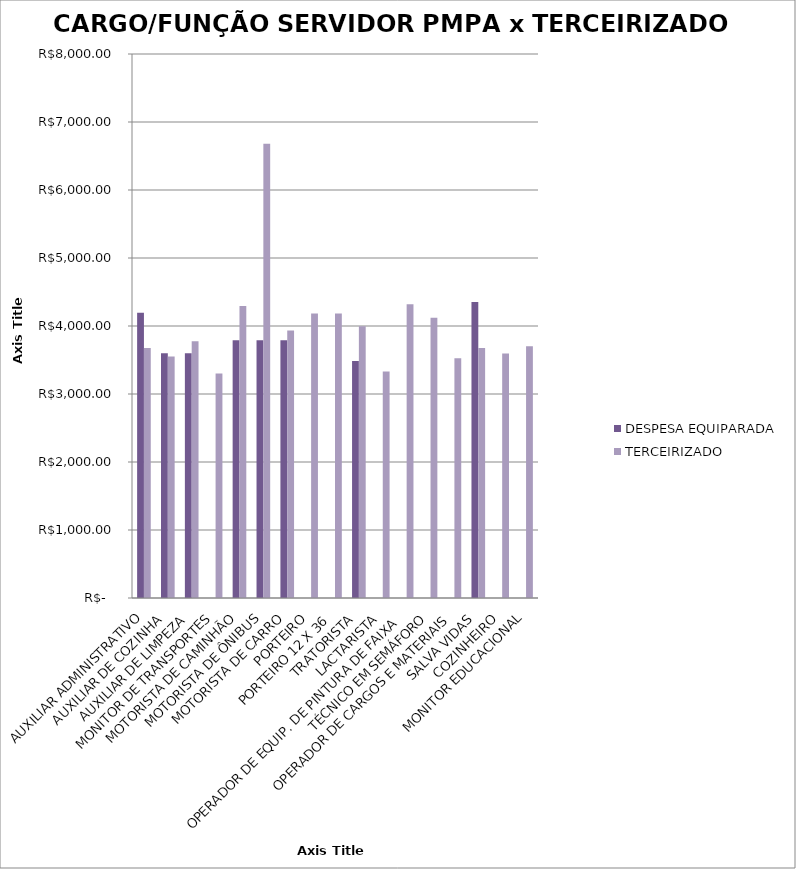
| Category | DESPESA EQUIPARADA | TERCEIRIZADO |
|---|---|---|
| AUXILIAR ADMINISTRATIVO | 4196.283 | 3677.59 |
| AUXILIAR DE COZINHA | 3598.96 | 3551.18 |
| AUXILIAR DE LIMPEZA | 3598.96 | 3777.25 |
| MONITOR DE TRANSPORTES | 0 | 3300.94 |
| MOTORISTA DE CAMINHÃO | 3789.031 | 4295.46 |
| MOTORISTA DE ÔNIBUS | 3789.031 | 6680.07 |
| MOTORISTA DE CARRO | 3789.031 | 3933.47 |
| PORTEIRO | 0 | 4185.48 |
| PORTEIRO 12 X 36 | 0 | 4185.48 |
| TRATORISTA | 3485.02 | 3995.07 |
| LACTARISTA | 0 | 3330.92 |
| OPERADOR DE EQUIP. DE PINTURA DE FAIXA | 0 | 4321.67 |
| TÉCNICO EM SEMÁFORO | 0 | 4122.88 |
| OPERADOR DE CARGOS E MATERIAIS | 0 | 3525.84 |
| SALVA VIDAS | 4354.044 | 3677.72 |
| COZINHEIRO | 0 | 3595.85 |
| MONITOR EDUCACIONAL | 0 | 3701.84 |